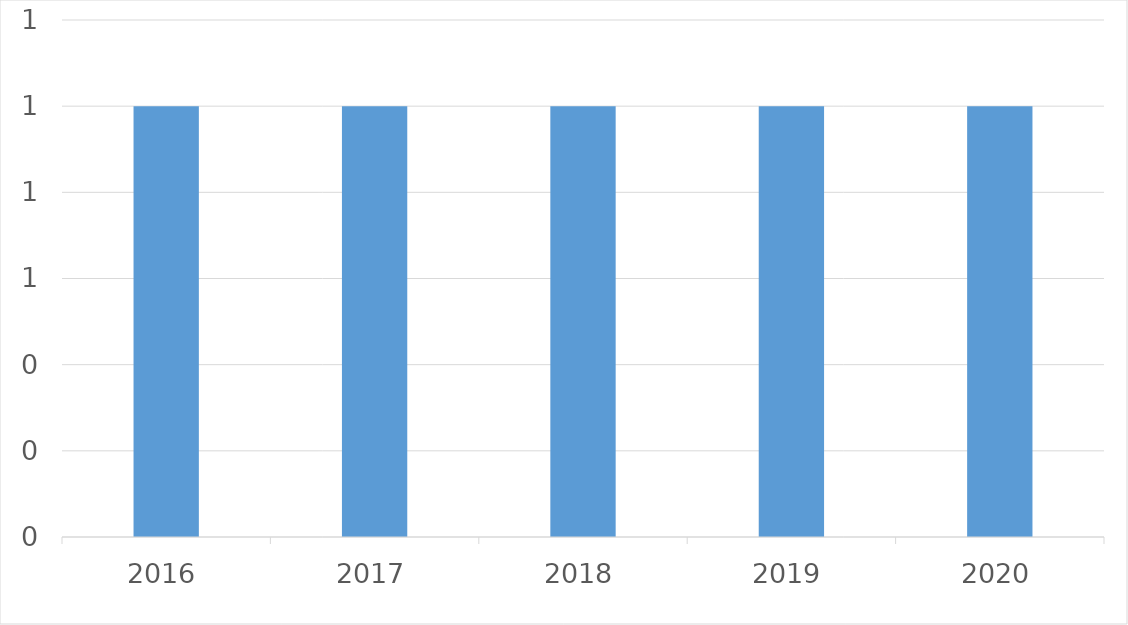
| Category | Series 0 |
|---|---|
| 2016 | 1 |
| 2017 | 1 |
| 2018 | 1 |
| 2019 | 1 |
| 2020 | 1 |